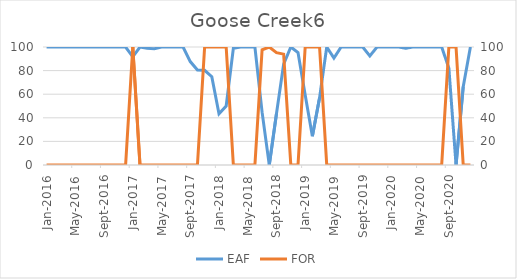
| Category | EAF |
|---|---|
| 2016-01-01 | 100 |
| 2016-02-01 | 100 |
| 2016-03-01 | 100 |
| 2016-04-01 | 100 |
| 2016-05-01 | 100 |
| 2016-06-01 | 100 |
| 2016-07-01 | 100 |
| 2016-08-01 | 100 |
| 2016-09-01 | 100 |
| 2016-10-01 | 100 |
| 2016-11-01 | 100 |
| 2016-12-01 | 100 |
| 2017-01-01 | 91.67 |
| 2017-02-01 | 100 |
| 2017-03-01 | 98.84 |
| 2017-04-01 | 98.49 |
| 2017-05-01 | 100 |
| 2017-06-01 | 100 |
| 2017-07-01 | 100 |
| 2017-08-01 | 100 |
| 2017-09-01 | 87.65 |
| 2017-10-01 | 80.58 |
| 2017-11-01 | 80.26 |
| 2017-12-01 | 74.8 |
| 2018-01-01 | 43.42 |
| 2018-02-01 | 50 |
| 2018-03-01 | 98.83 |
| 2018-04-01 | 100 |
| 2018-05-01 | 100 |
| 2018-06-01 | 100 |
| 2018-07-01 | 44.79 |
| 2018-08-01 | 0 |
| 2018-09-01 | 43.45 |
| 2018-10-01 | 85.55 |
| 2018-11-01 | 100 |
| 2018-12-01 | 95.27 |
| 2019-01-01 | 59.27 |
| 2019-02-01 | 24.41 |
| 2019-03-01 | 56.93 |
| 2019-04-01 | 100 |
| 2019-05-01 | 90.6 |
| 2019-06-01 | 100 |
| 2019-07-01 | 100 |
| 2019-08-01 | 100 |
| 2019-09-01 | 100 |
| 2019-10-01 | 92.42 |
| 2019-11-01 | 100 |
| 2019-12-01 | 100 |
| 2020-01-01 | 100 |
| 2020-02-01 | 100 |
| 2020-03-01 | 98.93 |
| 2020-04-01 | 100 |
| 2020-05-01 | 100 |
| 2020-06-01 | 100 |
| 2020-07-01 | 100 |
| 2020-08-01 | 100 |
| 2020-09-01 | 82.16 |
| 2020-10-01 | 0 |
| 2020-11-01 | 66.42 |
| 2020-12-01 | 100 |